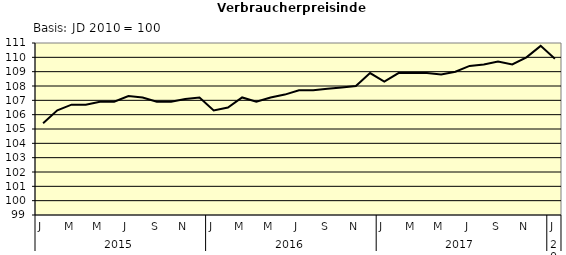
| Category | Series 0 |
|---|---|
| 0 | 105.4 |
| 1 | 106.3 |
| 2 | 106.7 |
| 3 | 106.7 |
| 4 | 106.9 |
| 5 | 106.9 |
| 6 | 107.3 |
| 7 | 107.2 |
| 8 | 106.9 |
| 9 | 106.9 |
| 10 | 107.1 |
| 11 | 107.2 |
| 12 | 106.3 |
| 13 | 106.5 |
| 14 | 107.2 |
| 15 | 106.9 |
| 16 | 107.2 |
| 17 | 107.4 |
| 18 | 107.7 |
| 19 | 107.7 |
| 20 | 107.8 |
| 21 | 107.9 |
| 22 | 108 |
| 23 | 108.9 |
| 24 | 108.3 |
| 25 | 108.9 |
| 26 | 108.9 |
| 27 | 108.9 |
| 28 | 108.8 |
| 29 | 109 |
| 30 | 109.4 |
| 31 | 109.5 |
| 32 | 109.7 |
| 33 | 109.5 |
| 34 | 110 |
| 35 | 110.8 |
| 36 | 109.9 |